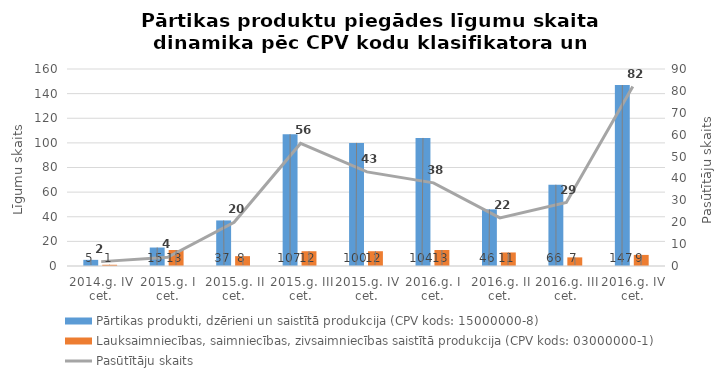
| Category | Pārtikas produkti, dzērieni un saistītā produkcija (CPV kods: 15000000-8) | Lauksaimniecības, saimniecības, zivsaimniecības saistītā produkcija (CPV kods: 03000000-1) |
|---|---|---|
| 2014.g. IV cet. | 5 | 1 |
| 2015.g. I cet. | 15 | 13 |
| 2015.g. II cet. | 37 | 8 |
| 2015.g. III cet. | 107 | 12 |
| 2015.g. IV cet. | 100 | 12 |
| 2016.g. I cet. | 104 | 13 |
| 2016.g. II cet. | 46 | 11 |
| 2016.g. III cet. | 66 | 7 |
| 2016.g. IV cet. | 147 | 9 |